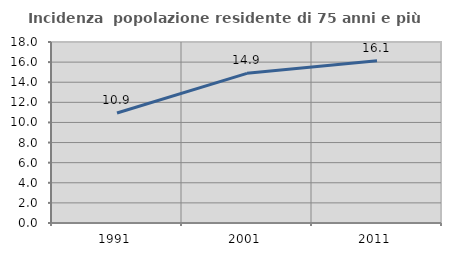
| Category | Incidenza  popolazione residente di 75 anni e più |
|---|---|
| 1991.0 | 10.935 |
| 2001.0 | 14.882 |
| 2011.0 | 16.124 |